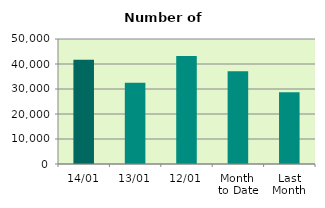
| Category | Series 0 |
|---|---|
| 14/01 | 41654 |
| 13/01 | 32540 |
| 12/01 | 43208 |
| Month 
to Date | 37124.8 |
| Last
Month | 28724.435 |